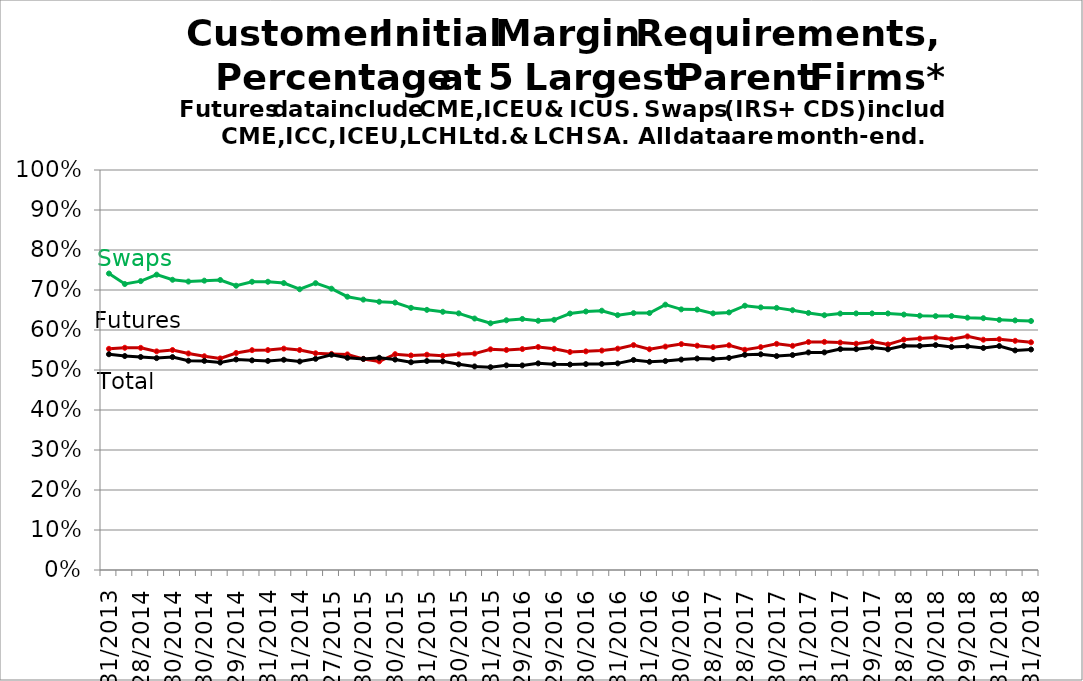
| Category | Futures | Swaps | Total | Series 8 | Series 9 |
|---|---|---|---|---|---|
| 2013-12-31 |  |  |  |  |  |
| nan |  |  |  |  |  |
| 2014-02-28 |  |  |  |  |  |
| nan |  |  |  |  |  |
| 2014-04-30 |  |  |  |  |  |
| nan |  |  |  |  |  |
| 2014-06-30 |  |  |  |  |  |
| nan |  |  |  |  |  |
| 2014-08-29 |  |  |  |  |  |
| nan |  |  |  |  |  |
| 2014-10-31 |  |  |  |  |  |
| nan |  |  |  |  |  |
| 2014-12-31 |  |  |  |  |  |
| nan |  |  |  |  |  |
| 2015-02-27 |  |  |  |  |  |
| nan |  |  |  |  |  |
| 2015-04-30 |  |  |  |  |  |
| nan |  |  |  |  |  |
| 2015-06-30 |  |  |  |  |  |
| nan |  |  |  |  |  |
| 2015-08-31 |  |  |  |  |  |
| nan |  |  |  |  |  |
| 2015-10-30 |  |  |  |  |  |
| nan |  |  |  |  |  |
| 2015-12-31 |  |  |  |  |  |
| nan |  |  |  |  |  |
| 2016-02-29 |  |  |  |  |  |
| nan |  |  |  |  |  |
| 2016-04-29 |  |  |  |  |  |
| nan |  |  |  |  |  |
| 2016-06-30 |  |  |  |  |  |
| nan |  |  |  |  |  |
| 2016-08-31 |  |  |  |  |  |
| nan |  |  |  |  |  |
| 2016-10-31 |  |  |  |  |  |
| nan |  |  |  |  |  |
| 2016-12-30 |  |  |  |  |  |
| nan |  |  |  |  |  |
| 2017-02-28 |  |  |  |  |  |
| nan |  |  |  |  |  |
| 2017-04-28 |  |  |  |  |  |
| nan |  |  |  |  |  |
| 2017-06-30 |  |  |  |  |  |
| nan |  |  |  |  |  |
| 2017-08-31 |  |  |  |  |  |
| nan |  |  |  |  |  |
| 2017-10-31 |  |  |  |  |  |
| nan |  |  |  |  |  |
| 2017-12-29 |  |  |  |  |  |
| nan |  |  |  |  |  |
| 2018-02-28 |  |  |  |  |  |
| nan |  |  |  |  |  |
| 2018-04-30 |  |  |  |  |  |
| nan |  |  |  |  |  |
| 2018-06-29 |  |  |  |  |  |
| nan |  |  |  |  |  |
| 2018-08-31 |  |  |  |  |  |
| nan |  |  |  |  |  |
| 2018-10-31 |  |  |  |  |  |